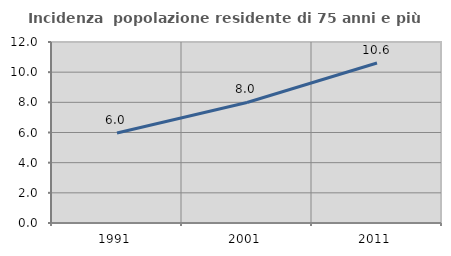
| Category | Incidenza  popolazione residente di 75 anni e più |
|---|---|
| 1991.0 | 5.964 |
| 2001.0 | 7.991 |
| 2011.0 | 10.604 |